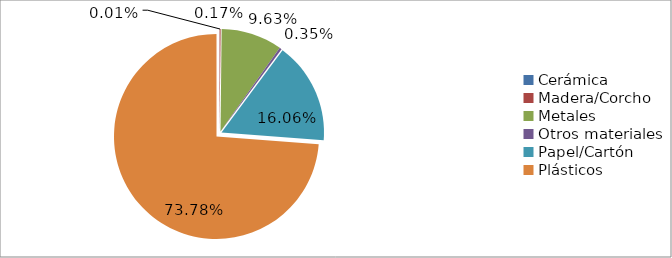
| Category | % |
|---|---|
| Cerámica | 0 |
| Madera/Corcho | 0.002 |
| Metales | 0.096 |
| Otros materiales | 0.004 |
| Papel/Cartón | 0.161 |
| Plásticos | 0.738 |